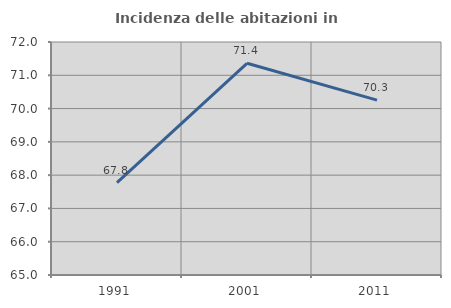
| Category | Incidenza delle abitazioni in proprietà  |
|---|---|
| 1991.0 | 67.773 |
| 2001.0 | 71.361 |
| 2011.0 | 70.255 |